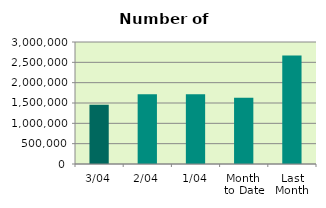
| Category | Series 0 |
|---|---|
| 3/04 | 1456278 |
| 2/04 | 1714486 |
| 1/04 | 1713328 |
| Month 
to Date | 1628030.667 |
| Last
Month | 2666736.455 |